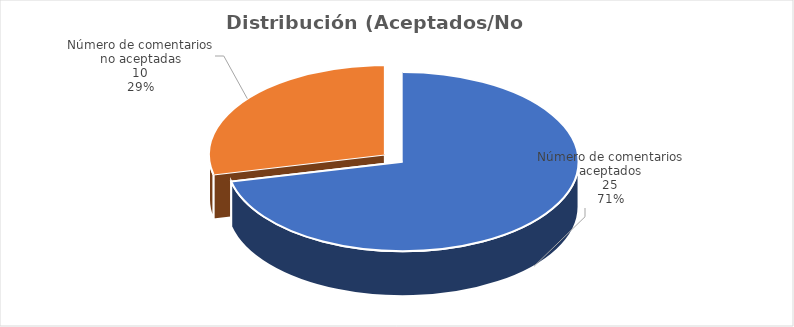
| Category | Series 0 |
|---|---|
| Número de comentarios aceptados | 25 |
| Número de comentarios no aceptadas | 10 |